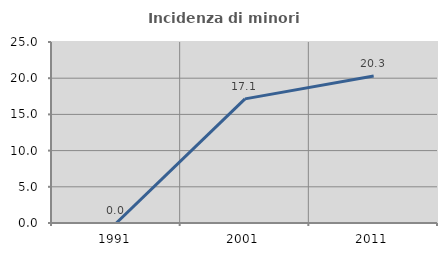
| Category | Incidenza di minori stranieri |
|---|---|
| 1991.0 | 0 |
| 2001.0 | 17.143 |
| 2011.0 | 20.301 |